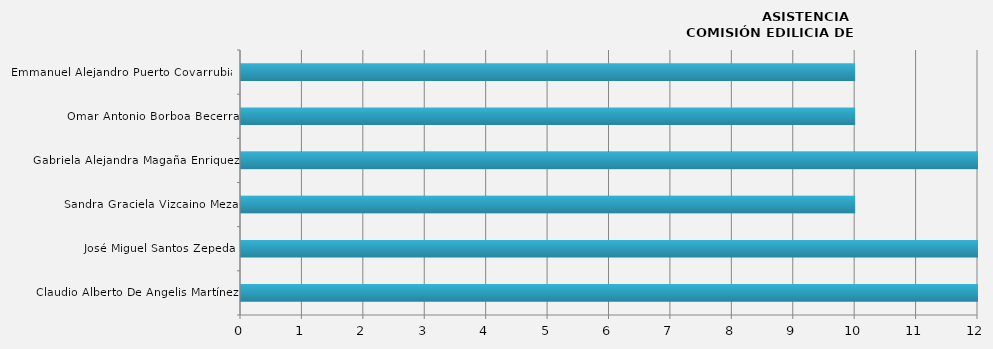
| Category | Series 0 |
|---|---|
| Claudio Alberto De Angelis Martínez | 12 |
| José Miguel Santos Zepeda | 12 |
| Sandra Graciela Vizcaino Meza | 10 |
| Gabriela Alejandra Magaña Enriquez | 12 |
| Omar Antonio Borboa Becerra | 10 |
| Emmanuel Alejandro Puerto Covarrubias | 10 |